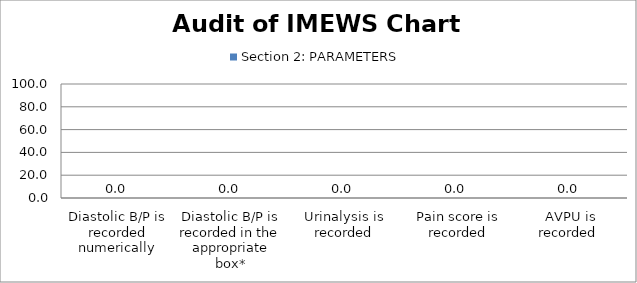
| Category | Section 2: PARAMETERS |
|---|---|
| Diastolic B/P is recorded numerically | 0 |
| Diastolic B/P is recorded in the appropriate box* | 0 |
| Urinalysis is recorded | 0 |
| Pain score is recorded | 0 |
| AVPU is recorded  | 0 |